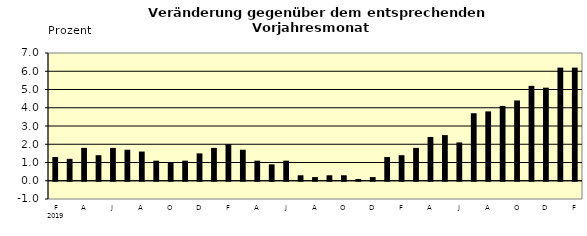
| Category | Series 0 |
|---|---|
| 0 | 1.3 |
| 1 | 1.2 |
| 2 | 1.8 |
| 3 | 1.4 |
| 4 | 1.8 |
| 5 | 1.7 |
| 6 | 1.6 |
| 7 | 1.1 |
| 8 | 1 |
| 9 | 1.1 |
| 10 | 1.5 |
| 11 | 1.8 |
| 12 | 2 |
| 13 | 1.7 |
| 14 | 1.1 |
| 15 | 0.9 |
| 16 | 1.1 |
| 17 | 0.3 |
| 18 | 0.2 |
| 19 | 0.3 |
| 20 | 0.3 |
| 21 | 0.1 |
| 22 | 0.2 |
| 23 | 1.3 |
| 24 | 1.4 |
| 25 | 1.8 |
| 26 | 2.4 |
| 27 | 2.5 |
| 28 | 2.1 |
| 29 | 3.7 |
| 30 | 3.8 |
| 31 | 4.1 |
| 32 | 4.4 |
| 33 | 5.2 |
| 34 | 5.1 |
| 35 | 6.2 |
| 36 | 6.2 |